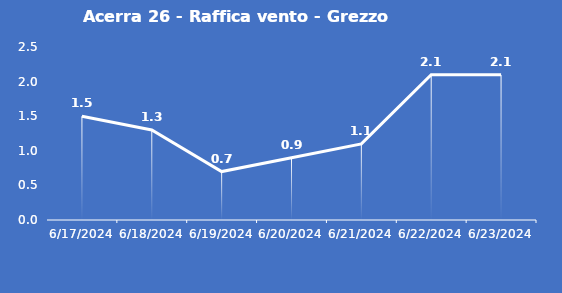
| Category | Acerra 26 - Raffica vento - Grezzo (m/s) |
|---|---|
| 6/17/24 | 1.5 |
| 6/18/24 | 1.3 |
| 6/19/24 | 0.7 |
| 6/20/24 | 0.9 |
| 6/21/24 | 1.1 |
| 6/22/24 | 2.1 |
| 6/23/24 | 2.1 |